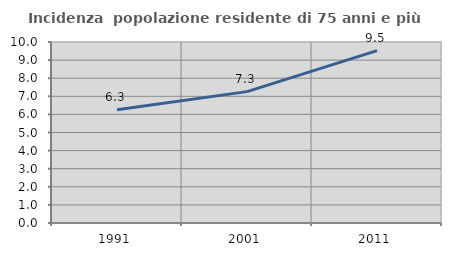
| Category | Incidenza  popolazione residente di 75 anni e più |
|---|---|
| 1991.0 | 6.257 |
| 2001.0 | 7.258 |
| 2011.0 | 9.52 |